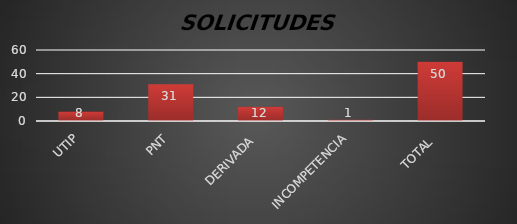
| Category | Series 1 |
|---|---|
| UTIP | 8 |
| PNT | 31 |
| DERIVADA  | 12 |
| INCOMPETENCIA | 1 |
| TOTAL  | 50 |